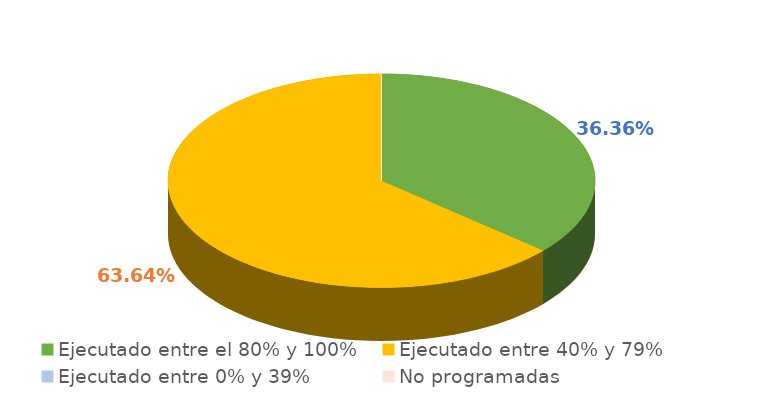
| Category | Series 0 |
|---|---|
| Ejecutado entre el 80% y 100% | 0.364 |
| Ejecutado entre 40% y 79% | 0.636 |
| Ejecutado entre 0% y 39% | 0 |
| No programadas | 0 |